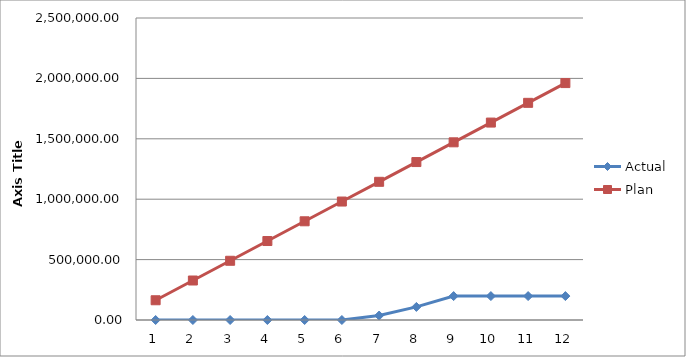
| Category | Actual | Plan |
|---|---|---|
| 0 | 0 | 163430.25 |
| 1 | 0 | 326860.5 |
| 2 | 0 | 490290.75 |
| 3 | 0 | 653721 |
| 4 | 0 | 817151.25 |
| 5 | 0 | 980581.5 |
| 6 | 36853.97 | 1144011.75 |
| 7 | 108316 | 1307442 |
| 8 | 197937.17 | 1470872.25 |
| 9 | 197937.17 | 1634302.5 |
| 10 | 197937.17 | 1797732.75 |
| 11 | 197937.17 | 1961163 |